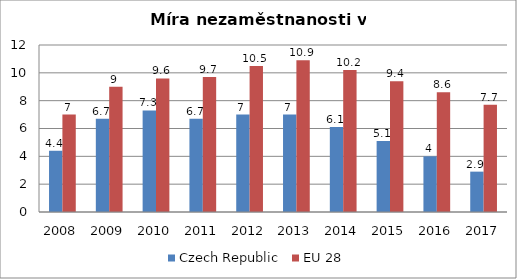
| Category | Czech Republic | EU 28 |
|---|---|---|
| 2008 | 4.4 | 7 |
| 2009 | 6.7 | 9 |
| 2010 | 7.3 | 9.6 |
| 2011 | 6.7 | 9.7 |
| 2012 | 7 | 10.5 |
| 2013 | 7 | 10.9 |
| 2014 | 6.1 | 10.2 |
| 2015 | 5.1 | 9.4 |
| 2016 | 4 | 8.6 |
| 2017 | 2.9 | 7.7 |